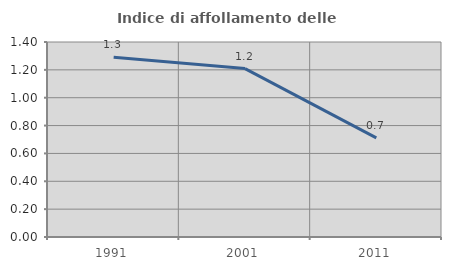
| Category | Indice di affollamento delle abitazioni  |
|---|---|
| 1991.0 | 1.291 |
| 2001.0 | 1.209 |
| 2011.0 | 0.712 |